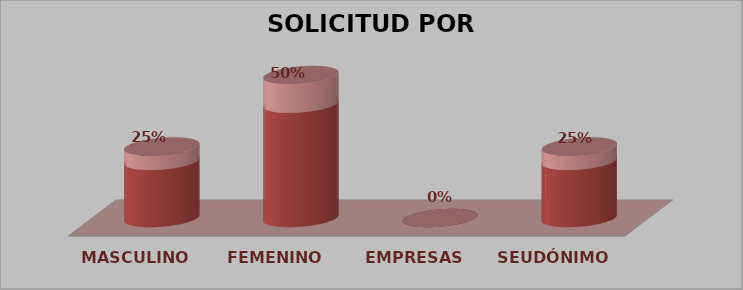
| Category | SOLICITUD POR GÉNERO | Series 1 |
|---|---|---|
| MASCULINO | 1 | 0.25 |
| FEMENINO | 2 | 0.5 |
| EMPRESAS | 0 | 0 |
| SEUDÓNIMO | 1 | 0.25 |